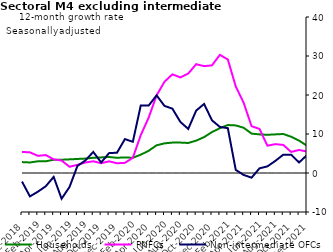
| Category | zero | Households | PNFCs | Non-intermediate OFCs |
|---|---|---|---|---|
| Dec-2018 | 0 | 2.8 | 5.4 | -2.2 |
| Jan-2019 | 0 | 2.7 | 5.3 | -6 |
| Feb-2019 | 0 | 3 | 4.4 | -4.8 |
| Mar-2019 | 0 | 3 | 4.6 | -3.4 |
| Apr-2019 | 0 | 3.4 | 3.5 | -1 |
| May-2019 | 0 | 3.4 | 3.2 | -6.6 |
| Jun-2019 | 0 | 3.5 | 1.6 | -3.6 |
| Jul-2019 | 0 | 3.6 | 2.1 | 1.8 |
| Aug-2019 | 0 | 3.7 | 2.7 | 3.2 |
| Sep-2019 | 0 | 3.9 | 3 | 5.4 |
| Oct-2019 | 0 | 4 | 2.5 | 2.7 |
| Nov-2019 | 0 | 4.1 | 3 | 5.1 |
| Dec-2019 | 0 | 3.9 | 2.5 | 5.2 |
| Jan-2020 | 0 | 4 | 2.6 | 8.7 |
| Feb-2020 | 0 | 3.9 | 3.9 | 8 |
| Mar-2020 | 0 | 4.7 | 9.7 | 17.3 |
| Apr-2020 | 0 | 5.7 | 14.2 | 17.3 |
| May-2020 | 0 | 7.1 | 19.9 | 19.9 |
| Jun-2020 | 0 | 7.6 | 23.4 | 17.2 |
| Jul-2020 | 0 | 7.8 | 25.3 | 16.5 |
| Aug-2020 | 0 | 7.8 | 24.5 | 13.1 |
| Sep-2020 | 0 | 7.7 | 25.5 | 11.3 |
| Oct-2020 | 0 | 8.3 | 27.9 | 16 |
| Nov-2020 | 0 | 9.2 | 27.4 | 17.7 |
| Dec-2020 | 0 | 10.5 | 27.6 | 13.5 |
| Jan-2021 | 0 | 11.5 | 30.3 | 11.8 |
| Feb-2021 | 0 | 12.3 | 29.1 | 11.5 |
| Mar-2021 | 0 | 12.2 | 22.2 | 0.8 |
| Apr-2021 | 0 | 11.6 | 18 | -0.5 |
| May-2021 | 0 | 10.1 | 12 | -1.2 |
| Jun-2021 | 0 | 9.9 | 11.3 | 1.2 |
| Jul-2021 | 0 | 9.8 | 7 | 1.7 |
| Aug-2021 | 0 | 9.9 | 7.4 | 3.1 |
| Sep-2021 | 0 | 10 | 7.2 | 4.7 |
| Oct-2021 | 0 | 9.3 | 5.4 | 4.7 |
| Nov-2021 | 0 | 8.3 | 5.9 | 2.7 |
| Dec-2021 | 0 | 7 | 5.5 | 4.6 |